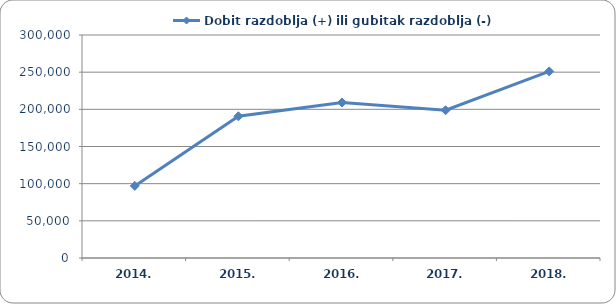
| Category | Dobit razdoblja (+) ili gubitak razdoblja (-)  |
|---|---|
| 2014. | 96993.803 |
| 2015. | 190653.381 |
| 2016. | 209158.624 |
| 2017. | 198773.716 |
| 2018. | 250983.665 |